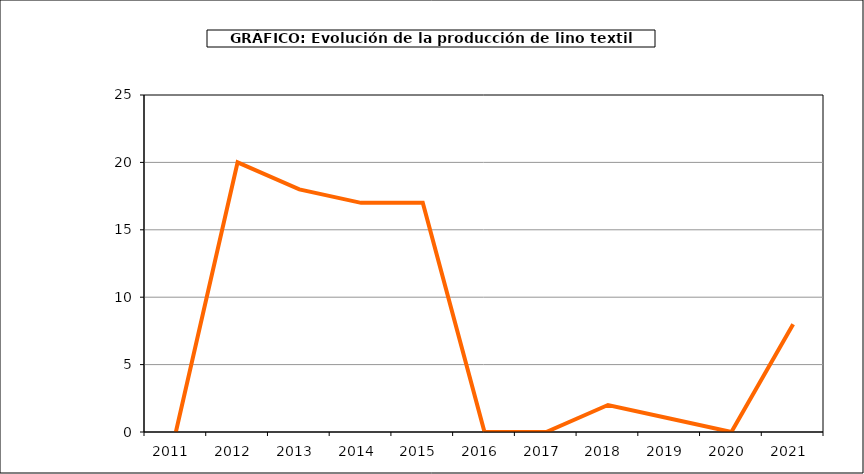
| Category | producción |
|---|---|
| 2011.0 | 0 |
| 2012.0 | 20 |
| 2013.0 | 18 |
| 2014.0 | 17 |
| 2015.0 | 17 |
| 2016.0 | 0 |
| 2017.0 | 0 |
| 2018.0 | 2 |
| 2019.0 | 1 |
| 2020.0 | 0 |
| 2021.0 | 8 |